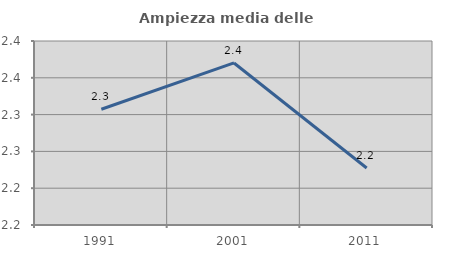
| Category | Ampiezza media delle famiglie |
|---|---|
| 1991.0 | 2.307 |
| 2001.0 | 2.37 |
| 2011.0 | 2.227 |